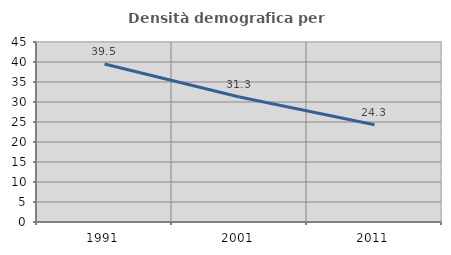
| Category | Densità demografica |
|---|---|
| 1991.0 | 39.514 |
| 2001.0 | 31.255 |
| 2011.0 | 24.317 |